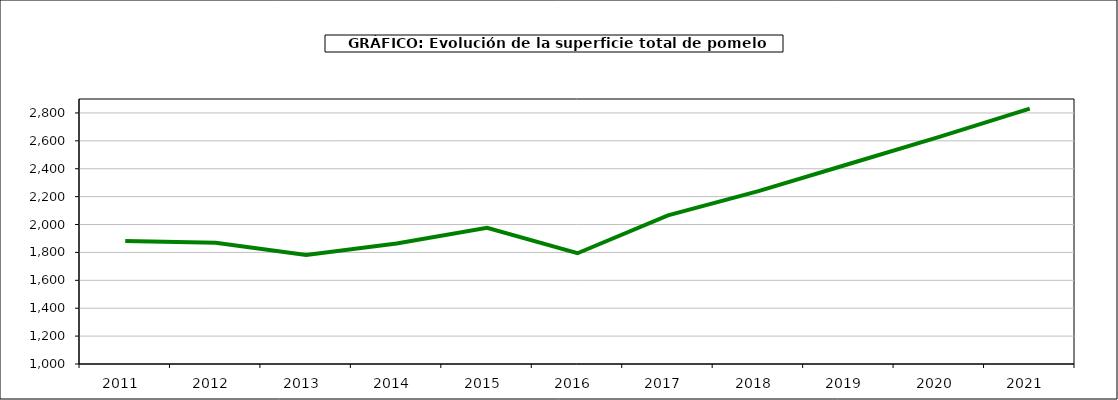
| Category | superficie |
|---|---|
| 2011.0 | 1882 |
| 2012.0 | 1869 |
| 2013.0 | 1781 |
| 2014.0 | 1864 |
| 2015.0 | 1976 |
| 2016.0 | 1794 |
| 2017.0 | 2066 |
| 2018.0 | 2239 |
| 2019.0 | 2434 |
| 2020.0 | 2628 |
| 2021.0 | 2831 |